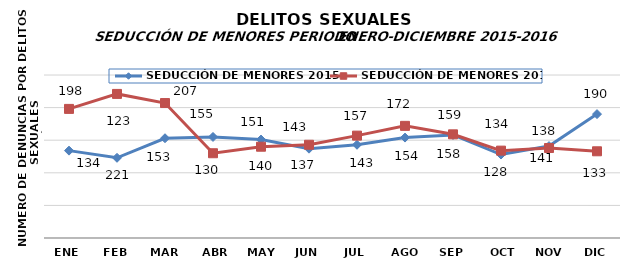
| Category | SEDUCCIÓN DE MENORES 2015 | SEDUCCIÓN DE MENORES 2016 |
|---|---|---|
| ENE | 134 | 198 |
| FEB | 123 | 221 |
| MAR | 153 | 207 |
| ABR | 155 | 130 |
| MAY | 151 | 140 |
| JUN | 137 | 143 |
| JUL | 143 | 157 |
| AGO | 154 | 172 |
| SEP | 158 | 159 |
| OCT | 128 | 134 |
| NOV | 141 | 138 |
| DIC | 190 | 133 |